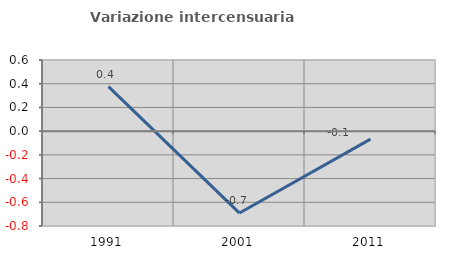
| Category | Variazione intercensuaria annua |
|---|---|
| 1991.0 | 0.376 |
| 2001.0 | -0.691 |
| 2011.0 | -0.068 |